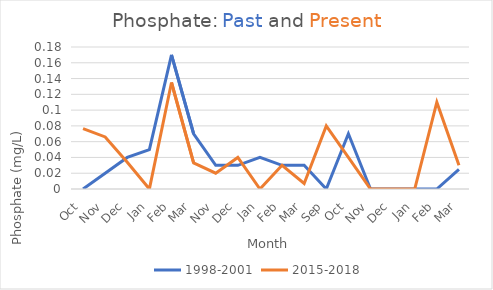
| Category | 1998-2001 | 2015-2018 |
|---|---|---|
| Oct | 0 | 0.076 |
| Nov | 0.02 | 0.066 |
| Dec | 0.04 | 0.034 |
| Jan | 0.05 | 0 |
| Feb | 0.17 | 0.135 |
| Mar | 0.07 | 0.033 |
| Nov | 0.03 | 0.02 |
| Dec | 0.03 | 0.04 |
| Jan | 0.04 | 0 |
| Feb | 0.03 | 0.03 |
| Mar | 0.03 | 0.007 |
| Sep | 0 | 0.08 |
| Oct | 0.07 | 0.04 |
| Nov | 0 | 0 |
| Dec | 0 | 0 |
| Jan | 0 | 0 |
| Feb | 0 | 0.11 |
| Mar | 0.025 | 0.03 |